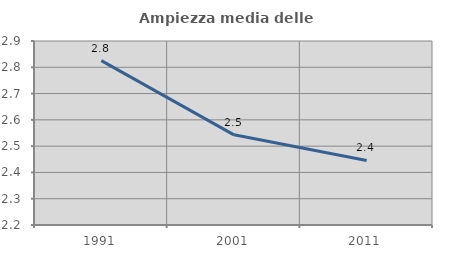
| Category | Ampiezza media delle famiglie |
|---|---|
| 1991.0 | 2.826 |
| 2001.0 | 2.543 |
| 2011.0 | 2.446 |